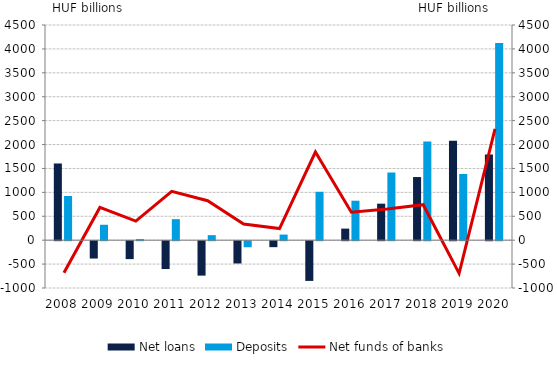
| Category | Net loans | Deposits |
|---|---|---|
| 2008.0 | 1604.117 | 924.526 |
| 2009.0 | -363.024 | 322.449 |
| 2010.0 | -375.15 | 23.517 |
| 2011.0 | -582.414 | 439.017 |
| 2012.0 | -720.502 | 104.961 |
| 2013.0 | -466.305 | -126.817 |
| 2014.0 | -125.073 | 117.279 |
| 2015.0 | -830.803 | 1012.037 |
| 2016.0 | 241.811 | 825.492 |
| 2017.0 | 763.636 | 1415.416 |
| 2018.0 | 1320.254 | 2062.225 |
| 2019.0 | 2077.859 | 1384.024 |
| 2020.0 | 1791.689 | 4121.545 |